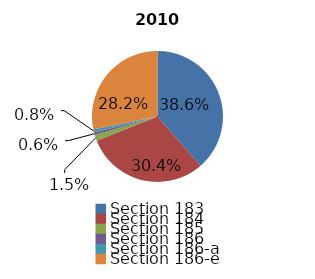
| Category | 2010 |
|---|---|
| Section 183 | 1188 |
| Section 184 | 935 |
| Section 185 | 46 |
| Section 186 | 19 |
| Section 186-a | 24 |
| Section 186-e | 867 |